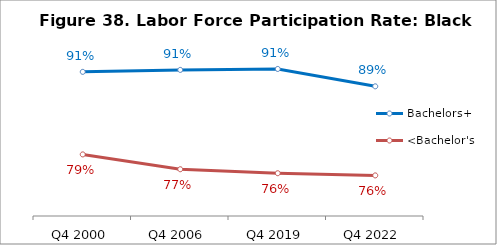
| Category | Bachelors+ | <Bachelor's |
|---|---|---|
| Q4 2000 | 0.907 | 0.788 |
| Q4 2006 | 0.91 | 0.767 |
| Q4 2019 | 0.911 | 0.761 |
| Q4 2022 | 0.886 | 0.758 |